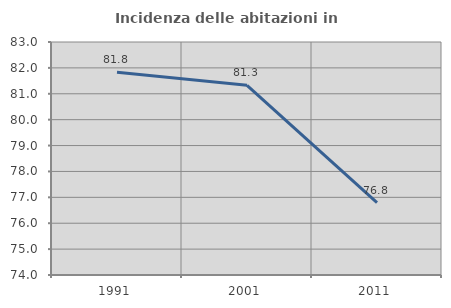
| Category | Incidenza delle abitazioni in proprietà  |
|---|---|
| 1991.0 | 81.831 |
| 2001.0 | 81.326 |
| 2011.0 | 76.798 |